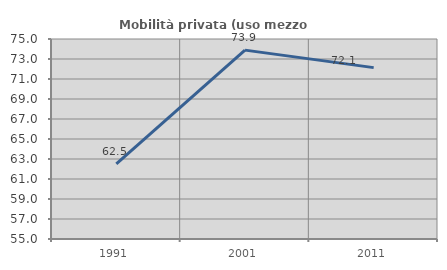
| Category | Mobilità privata (uso mezzo privato) |
|---|---|
| 1991.0 | 62.507 |
| 2001.0 | 73.888 |
| 2011.0 | 72.137 |